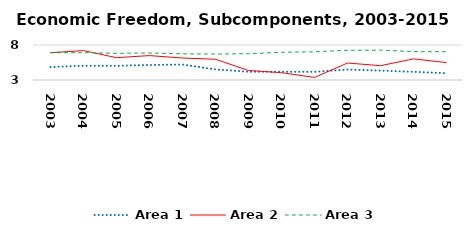
| Category | Area 1 | Area 2 | Area 3 |
|---|---|---|---|
| 2003.0 | 4.848 | 6.904 | 6.896 |
| 2004.0 | 5.034 | 7.2 | 6.902 |
| 2005.0 | 5.027 | 6.189 | 6.808 |
| 2006.0 | 5.146 | 6.487 | 6.859 |
| 2007.0 | 5.21 | 6.137 | 6.735 |
| 2008.0 | 4.514 | 5.96 | 6.703 |
| 2009.0 | 4.177 | 4.361 | 6.76 |
| 2010.0 | 4.178 | 4.046 | 6.962 |
| 2011.0 | 4.167 | 3.366 | 7.025 |
| 2012.0 | 4.493 | 5.425 | 7.245 |
| 2013.0 | 4.341 | 5.046 | 7.268 |
| 2014.0 | 4.169 | 6.011 | 7.053 |
| 2015.0 | 3.964 | 5.487 | 7.037 |